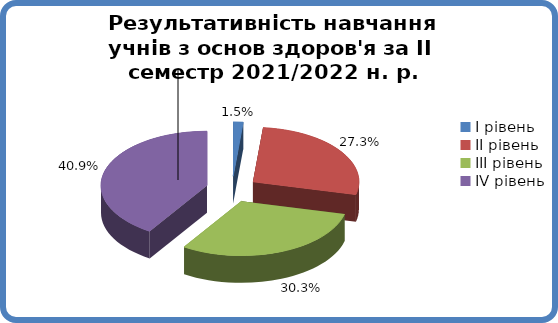
| Category | Series 0 |
|---|---|
| 0 | 0.015 |
| 1 | 0.273 |
| 2 | 0.303 |
| 3 | 0.409 |